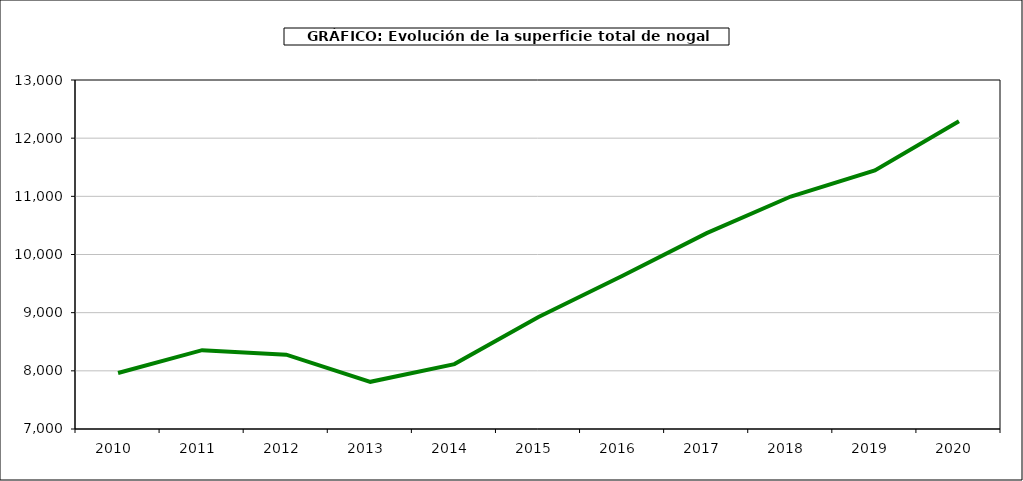
| Category | superficie nogal |
|---|---|
| 2010.0 | 7962 |
| 2011.0 | 8355 |
| 2012.0 | 8278 |
| 2013.0 | 7811 |
| 2014.0 | 8116 |
| 2015.0 | 8926 |
| 2016.0 | 9634 |
| 2017.0 | 10367 |
| 2018.0 | 10997 |
| 2019.0 | 11444 |
| 2020.0 | 12290 |